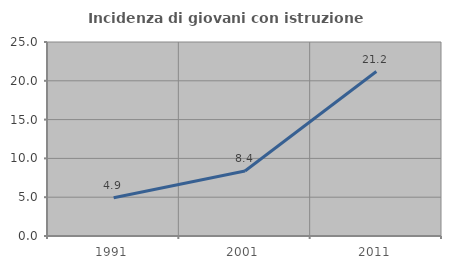
| Category | Incidenza di giovani con istruzione universitaria |
|---|---|
| 1991.0 | 4.921 |
| 2001.0 | 8.377 |
| 2011.0 | 21.196 |